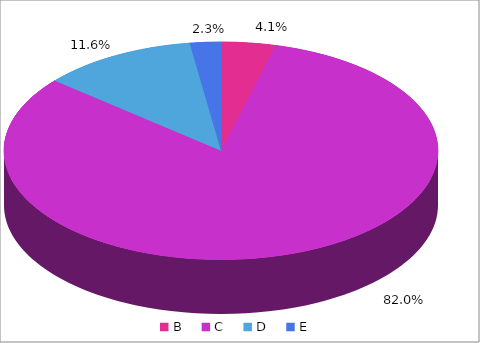
| Category | Series 0 |
|---|---|
| B | 4.057 |
| C | 82.05 |
| D | 11.589 |
| E | 2.305 |